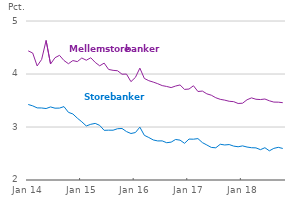
| Category | Store banker | Mellemstore banker |
|---|---|---|
| 2014-01-01 | 3.425 | 4.436 |
| 2014-02-01 | 3.399 | 4.396 |
| 2014-03-01 | 3.361 | 4.152 |
| 2014-04-01 | 3.359 | 4.274 |
| 2014-05-01 | 3.348 | 4.633 |
| 2014-06-01 | 3.379 | 4.188 |
| 2014-07-01 | 3.355 | 4.308 |
| 2014-08-01 | 3.357 | 4.352 |
| 2014-09-01 | 3.385 | 4.255 |
| 2014-10-01 | 3.277 | 4.194 |
| 2014-11-01 | 3.246 | 4.253 |
| 2014-12-01 | 3.167 | 4.234 |
| 2015-01-01 | 3.098 | 4.302 |
| 2015-02-01 | 3.02 | 4.259 |
| 2015-03-01 | 3.051 | 4.306 |
| 2015-04-01 | 3.068 | 4.219 |
| 2015-05-01 | 3.031 | 4.155 |
| 2015-06-01 | 2.937 | 4.205 |
| 2015-07-01 | 2.94 | 4.086 |
| 2015-08-01 | 2.939 | 4.069 |
| 2015-09-01 | 2.967 | 4.061 |
| 2015-10-01 | 2.972 | 3.996 |
| 2015-11-01 | 2.914 | 3.999 |
| 2015-12-01 | 2.877 | 3.856 |
| 2016-01-01 | 2.895 | 3.936 |
| 2016-02-01 | 2.997 | 4.111 |
| 2016-03-01 | 2.843 | 3.916 |
| 2016-04-01 | 2.802 | 3.874 |
| 2016-05-01 | 2.755 | 3.847 |
| 2016-06-01 | 2.737 | 3.817 |
| 2016-07-01 | 2.738 | 3.781 |
| 2016-08-01 | 2.704 | 3.765 |
| 2016-09-01 | 2.714 | 3.744 |
| 2016-10-01 | 2.765 | 3.773 |
| 2016-11-01 | 2.752 | 3.793 |
| 2016-12-01 | 2.692 | 3.71 |
| 2017-01-01 | 2.772 | 3.716 |
| 2017-02-01 | 2.77 | 3.778 |
| 2017-03-01 | 2.781 | 3.67 |
| 2017-04-01 | 2.706 | 3.678 |
| 2017-05-01 | 2.661 | 3.626 |
| 2017-06-01 | 2.614 | 3.6 |
| 2017-07-01 | 2.608 | 3.552 |
| 2017-08-01 | 2.674 | 3.522 |
| 2017-09-01 | 2.661 | 3.507 |
| 2017-10-01 | 2.669 | 3.485 |
| 2017-11-01 | 2.64 | 3.478 |
| 2017-12-01 | 2.627 | 3.444 |
| 2018-01-01 | 2.644 | 3.449 |
| 2018-02-01 | 2.622 | 3.514 |
| 2018-03-01 | 2.609 | 3.549 |
| 2018-04-01 | 2.606 | 3.524 |
| 2018-05-01 | 2.572 | 3.518 |
| 2018-06-01 | 2.609 | 3.528 |
| 2018-07-01 | 2.551 | 3.495 |
| 2018-08-01 | 2.597 | 3.47 |
| 2018-09-01 | 2.616 | 3.469 |
| 2018-10-01 | 2.595 | 3.459 |